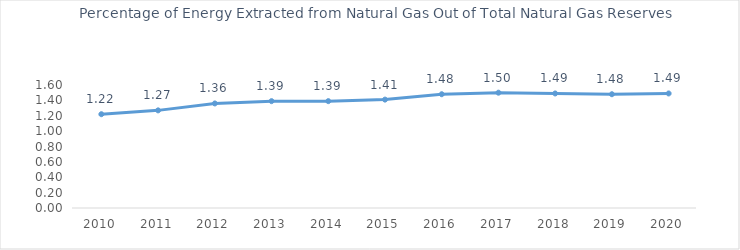
| Category | Natural Gas Extraction Percentage  |
|---|---|
| 2010.0 | 1.22 |
| 2011.0 | 1.27 |
| 2012.0 | 1.36 |
| 2013.0 | 1.39 |
| 2014.0 | 1.39 |
| 2015.0 | 1.41 |
| 2016.0 | 1.48 |
| 2017.0 | 1.5 |
| 2018.0 | 1.49 |
| 2019.0 | 1.48 |
| 2020.0 | 1.49 |